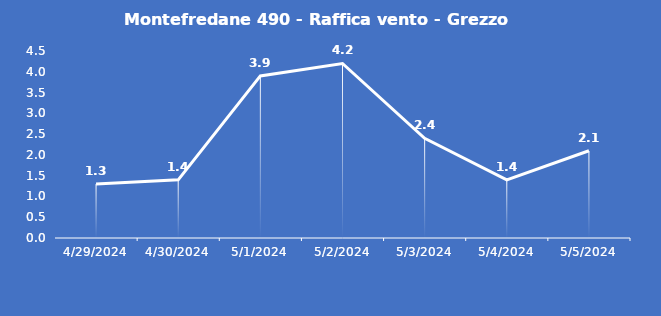
| Category | Montefredane 490 - Raffica vento - Grezzo (m/s) |
|---|---|
| 4/29/24 | 1.3 |
| 4/30/24 | 1.4 |
| 5/1/24 | 3.9 |
| 5/2/24 | 4.2 |
| 5/3/24 | 2.4 |
| 5/4/24 | 1.4 |
| 5/5/24 | 2.1 |